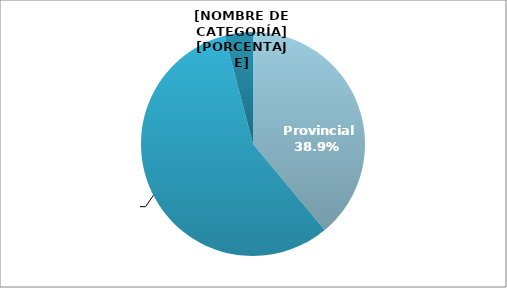
| Category | Series 0 |
|---|---|
| Provincial | 11068 |
| Municipal | 16193 |
| Nacional | 1158 |